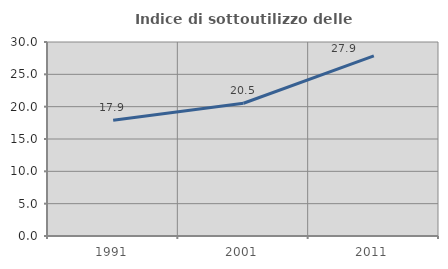
| Category | Indice di sottoutilizzo delle abitazioni  |
|---|---|
| 1991.0 | 17.886 |
| 2001.0 | 20.524 |
| 2011.0 | 27.861 |